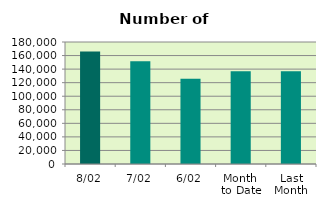
| Category | Series 0 |
|---|---|
| 8/02 | 166168 |
| 7/02 | 151520 |
| 6/02 | 125916 |
| Month 
to Date | 136791 |
| Last
Month | 136846.364 |